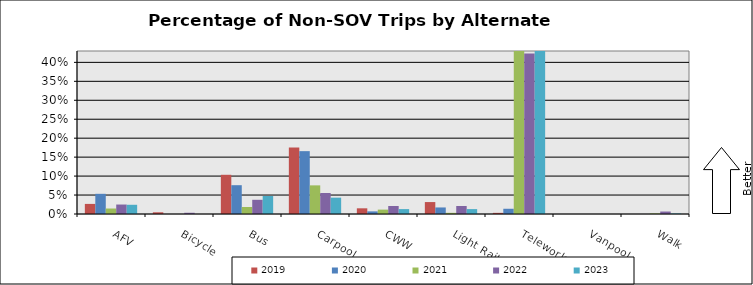
| Category | 2019 | 2020 | 2021 | 2022 | 2023 |
|---|---|---|---|---|---|
| AFV | 0.027 | 0.053 | 0.014 | 0.025 | 0.024 |
| Bicycle | 0.004 | 0 | 0 | 0.003 | 0 |
| Bus | 0.103 | 0.076 | 0.019 | 0.037 | 0.047 |
| Carpool | 0.175 | 0.166 | 0.076 | 0.055 | 0.043 |
| CWW | 0.015 | 0.007 | 0.012 | 0.021 | 0.013 |
| Light Rail | 0.031 | 0.017 | 0.003 | 0.021 | 0.013 |
| Telework | 0.003 | 0.014 | 0.475 | 0.423 | 0.463 |
| Vanpool | 0 | 0 | 0 | 0 | 0 |
| Walk | 0 | 0 | 0.002 | 0.007 | 0.001 |